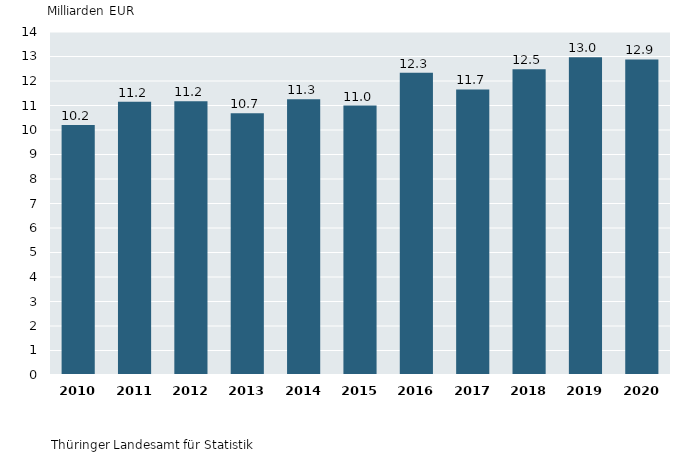
| Category | 1. Bruttoanlageinvestitionen in Thüringen 2010 bis 2020 in jeweiligen Preisen  |
|---|---|
| 2010.0 | 10.208 |
| 2011.0 | 11.15 |
| 2012.0 | 11.174 |
| 2013.0 | 10.688 |
| 2014.0 | 11.258 |
| 2015.0 | 10.995 |
| 2016.0 | 12.338 |
| 2017.0 | 11.654 |
| 2018.0 | 12.478 |
| 2019.0 | 12.97 |
| 2020.0 | 12.882 |